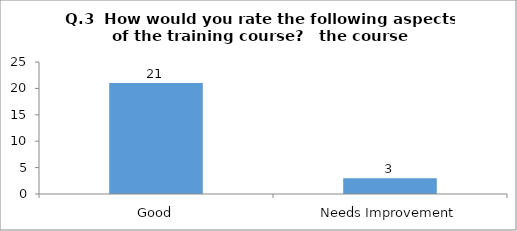
| Category | Q.3  How would you rate the following aspects of the training course?  |
|---|---|
| Good | 21 |
| Needs Improvement | 3 |